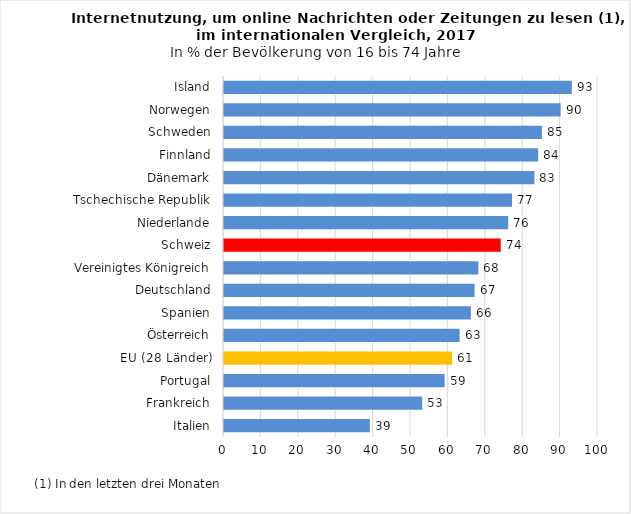
| Category | Nachrichten, Zeitungen oder Magazine lesen |
|---|---|
| Italien | 39 |
| Frankreich | 53 |
| Portugal | 59 |
| EU (28 Länder) | 61 |
| Österreich | 63 |
| Spanien | 66 |
| Deutschland | 67 |
| Vereinigtes Königreich | 68 |
| Schweiz | 74 |
| Niederlande | 76 |
| Tschechische Republik | 77 |
| Dänemark | 83 |
| Finnland | 84 |
| Schweden | 85 |
| Norwegen | 90 |
| Island | 93 |